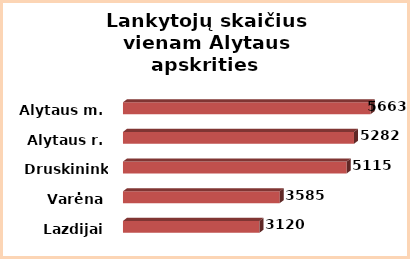
| Category | Series 0 |
|---|---|
| Lazdijai | 3120 |
| Varėna | 3585 |
| Druskininkai | 5115 |
| Alytaus r. | 5282 |
| Alytaus m. | 5663 |